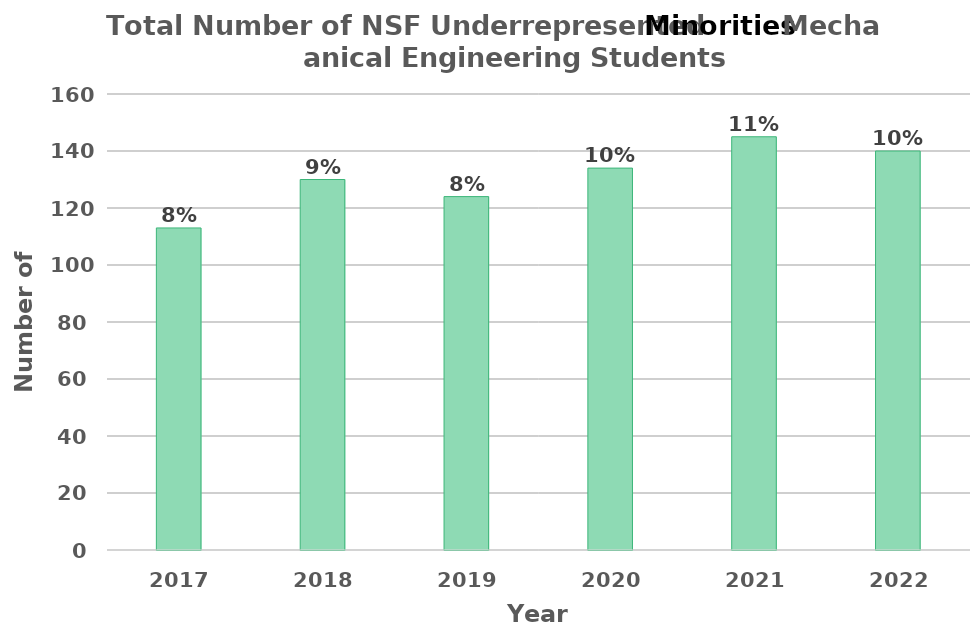
| Category | Total Number of NSF Underrepresented Mechanical Engineering Students |
|---|---|
| 2017.0 | 113 |
| 2018.0 | 130 |
| 2019.0 | 124 |
| 2020.0 | 134 |
| 2021.0 | 145 |
| 2022.0 | 140 |